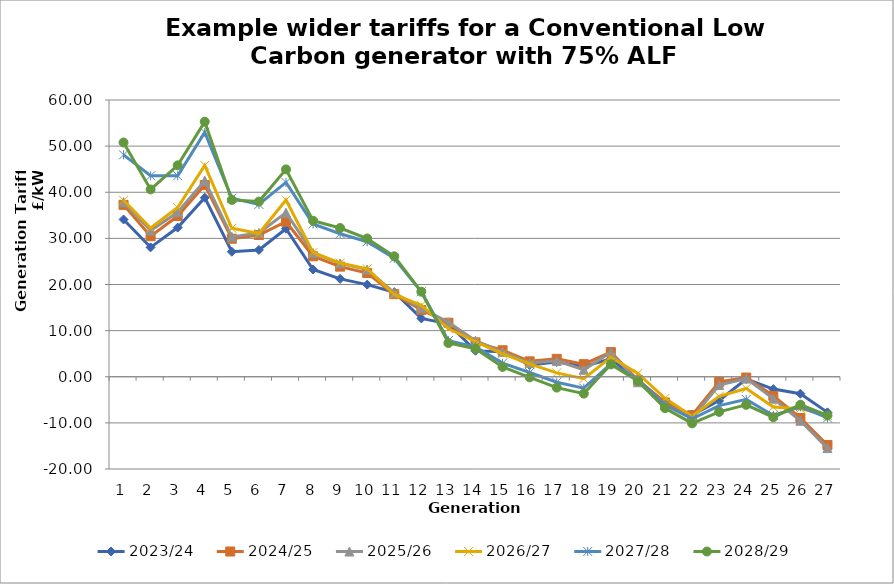
| Category | 2023/24 | 2024/25 | 2025/26 | 2026/27 | 2027/28 | 2028/29 |
|---|---|---|---|---|---|---|
| 0 | 34.096 | 37.266 | 37.843 | 38.265 | 48.108 | 50.785 |
| 1 | 28.05 | 30.468 | 31.706 | 32.247 | 43.571 | 40.613 |
| 2 | 32.339 | 34.835 | 35.656 | 36.686 | 43.583 | 45.836 |
| 3 | 38.818 | 41.564 | 42.518 | 45.838 | 52.988 | 55.295 |
| 4 | 27.107 | 29.925 | 30.328 | 32.185 | 38.707 | 38.334 |
| 5 | 27.497 | 30.725 | 31.171 | 31.043 | 37.361 | 37.976 |
| 6 | 32.093 | 33.614 | 35.588 | 38.297 | 42.124 | 44.956 |
| 7 | 23.26 | 26.115 | 26.806 | 26.938 | 33.135 | 33.828 |
| 8 | 21.221 | 23.873 | 24.585 | 24.654 | 31.006 | 32.244 |
| 9 | 19.977 | 22.479 | 23.233 | 23.404 | 29.278 | 29.976 |
| 10 | 18.334 | 17.903 | 18.155 | 17.833 | 25.678 | 26.116 |
| 11 | 12.64 | 14.468 | 14.879 | 15.497 | 18.432 | 18.435 |
| 12 | 11.47 | 11.711 | 11.809 | 10.449 | 7.835 | 7.318 |
| 13 | 5.638 | 7.457 | 7.811 | 7.627 | 6.489 | 6.067 |
| 14 | 5.424 | 5.746 | 5.4 | 4.955 | 2.947 | 2.13 |
| 15 | 2.553 | 3.339 | 2.972 | 2.774 | 0.929 | -0.127 |
| 16 | 3.206 | 3.889 | 3.44 | 0.831 | -1.182 | -2.354 |
| 17 | 2.237 | 2.729 | 1.517 | -0.428 | -2.476 | -3.661 |
| 18 | 3.883 | 5.344 | 5.305 | 4.207 | 2.806 | 2.669 |
| 19 | -0.765 | -0.746 | -1.19 | 0.73 | -0.582 | -0.907 |
| 20 | -5.622 | -5.582 | -6.074 | -4.67 | -6.09 | -6.815 |
| 21 | -8.301 | -8.335 | -8.953 | -8.555 | -9.113 | -10.105 |
| 22 | -5.131 | -1.133 | -1.774 | -4.242 | -6.256 | -7.623 |
| 23 | -0.495 | -0.17 | -0.38 | -2.549 | -4.912 | -6.088 |
| 24 | -2.677 | -4.128 | -4.749 | -6.574 | -8.383 | -8.777 |
| 25 | -3.672 | -8.955 | -9.532 | -6.92 | -6.495 | -6.058 |
| 26 | -7.721 | -14.786 | -15.469 | -8.396 | -8.937 | -8.403 |